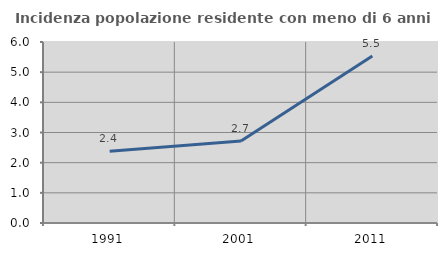
| Category | Incidenza popolazione residente con meno di 6 anni |
|---|---|
| 1991.0 | 2.381 |
| 2001.0 | 2.718 |
| 2011.0 | 5.534 |